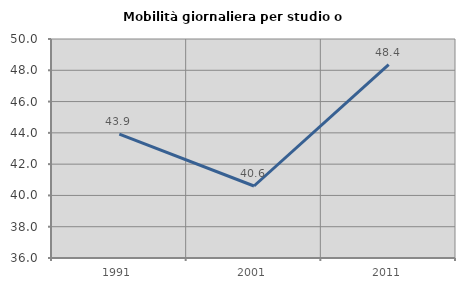
| Category | Mobilità giornaliera per studio o lavoro |
|---|---|
| 1991.0 | 43.914 |
| 2001.0 | 40.603 |
| 2011.0 | 48.364 |